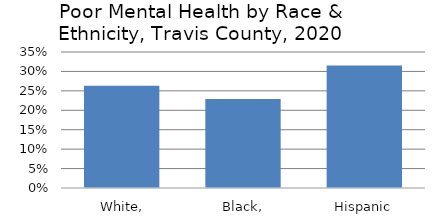
| Category | Series 0 |
|---|---|
| White, Non-Hispanic | 0.263 |
| Black, Non-Hispanic | 0.229 |
| Hispanic | 0.315 |